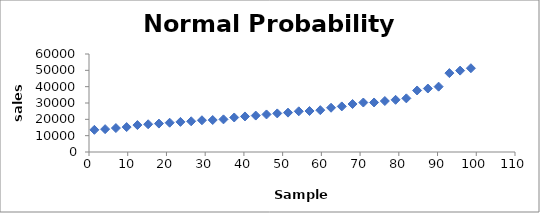
| Category | Series 0 |
|---|---|
| 1.3888888888888888 | 13569 |
| 4.166666666666666 | 13989 |
| 6.944444444444445 | 14661 |
| 9.722222222222221 | 15267 |
| 12.5 | 16484 |
| 15.277777777777779 | 16980 |
| 18.055555555555554 | 17396 |
| 20.833333333333332 | 17935 |
| 23.61111111111111 | 18430 |
| 26.38888888888889 | 18796 |
| 29.166666666666668 | 19437 |
| 31.944444444444443 | 19573 |
| 34.722222222222214 | 19982 |
| 37.49999999999999 | 21133 |
| 40.27777777777777 | 21769 |
| 43.05555555555555 | 22303 |
| 45.83333333333333 | 22993 |
| 48.61111111111111 | 23628 |
| 51.388888888888886 | 24098 |
| 54.166666666666664 | 24919 |
| 56.94444444444444 | 25094 |
| 59.722222222222214 | 25618 |
| 62.49999999999999 | 27093 |
| 65.27777777777777 | 27909 |
| 68.05555555555554 | 29381 |
| 70.83333333333333 | 30292 |
| 73.6111111111111 | 30316 |
| 76.38888888888889 | 31206 |
| 79.16666666666666 | 31948 |
| 81.94444444444444 | 32844 |
| 84.72222222222221 | 37668 |
| 87.5 | 38867 |
| 90.27777777777777 | 40008 |
| 93.05555555555554 | 48292 |
| 95.83333333333333 | 49829 |
| 98.6111111111111 | 51292 |